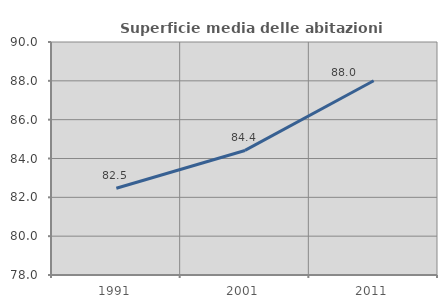
| Category | Superficie media delle abitazioni occupate |
|---|---|
| 1991.0 | 82.467 |
| 2001.0 | 84.415 |
| 2011.0 | 88.007 |